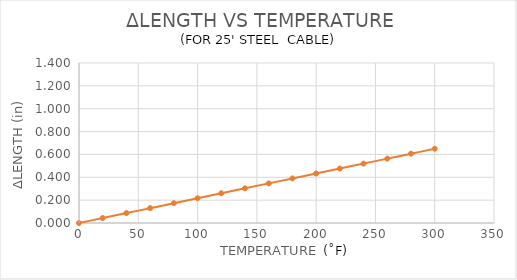
| Category | Series 0 |
|---|---|
| 0.0 | 0 |
| 20.0 | 0.043 |
| 40.0 | 0.087 |
| 60.0 | 0.13 |
| 80.0 | 0.173 |
| 100.0 | 0.217 |
| 120.0 | 0.26 |
| 140.0 | 0.303 |
| 160.0 | 0.347 |
| 180.0 | 0.39 |
| 200.0 | 0.433 |
| 220.0 | 0.477 |
| 240.0 | 0.52 |
| 260.0 | 0.563 |
| 280.0 | 0.606 |
| 300.0 | 0.65 |